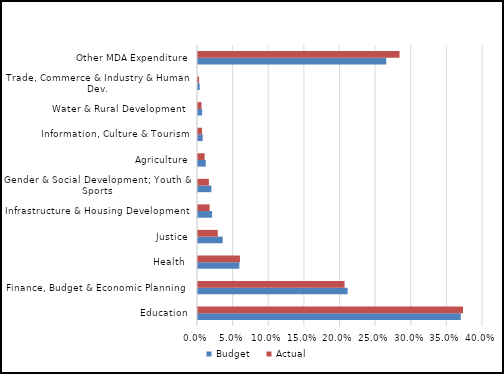
| Category | Budget  | Actual |
|---|---|---|
| Education | 0.369 | 0.372 |
| Finance, Budget & Economic Planning  | 0.21 | 0.206 |
| Health  | 0.058 | 0.059 |
| Justice | 0.035 | 0.028 |
| Infrastructure & Housing Development | 0.02 | 0.016 |
| Gender & Social Development; Youth & Sports | 0.019 | 0.015 |
| Agriculture | 0.011 | 0.009 |
| Information, Culture & Tourism | 0.007 | 0.006 |
| Water & Rural Development  | 0.006 | 0.005 |
| Trade, Commerce & Industry & Human Dev. | 0.002 | 0.001 |
| Other MDA Expenditure | 0.264 | 0.283 |